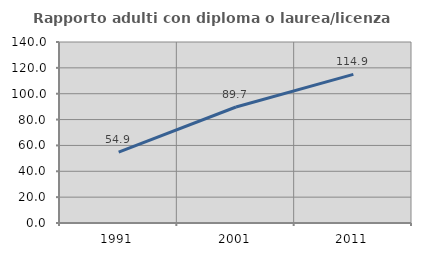
| Category | Rapporto adulti con diploma o laurea/licenza media  |
|---|---|
| 1991.0 | 54.851 |
| 2001.0 | 89.726 |
| 2011.0 | 114.937 |